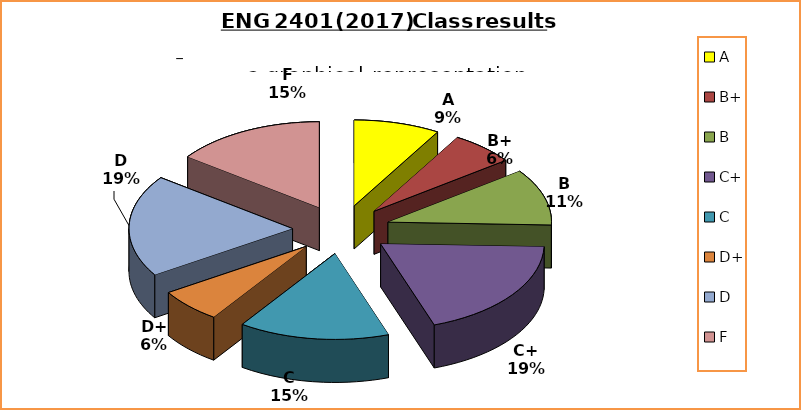
| Category | Series 0 |
|---|---|
| A | 4 |
| B+ | 3 |
| B | 5 |
| C+ | 9 |
| C | 7 |
| D+ | 3 |
| D | 9 |
| F | 7 |